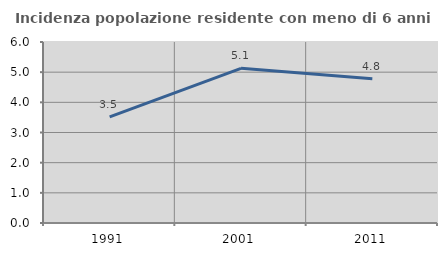
| Category | Incidenza popolazione residente con meno di 6 anni |
|---|---|
| 1991.0 | 3.519 |
| 2001.0 | 5.127 |
| 2011.0 | 4.785 |